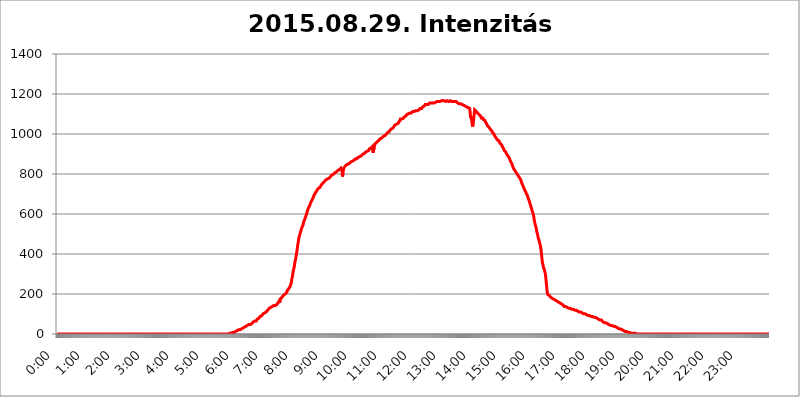
| Category | 2015.08.29. Intenzitás [W/m^2] |
|---|---|
| 0.0 | 0 |
| 0.0006944444444444445 | 0 |
| 0.001388888888888889 | 0 |
| 0.0020833333333333333 | 0 |
| 0.002777777777777778 | 0 |
| 0.003472222222222222 | 0 |
| 0.004166666666666667 | 0 |
| 0.004861111111111111 | 0 |
| 0.005555555555555556 | 0 |
| 0.0062499999999999995 | 0 |
| 0.006944444444444444 | 0 |
| 0.007638888888888889 | 0 |
| 0.008333333333333333 | 0 |
| 0.009027777777777779 | 0 |
| 0.009722222222222222 | 0 |
| 0.010416666666666666 | 0 |
| 0.011111111111111112 | 0 |
| 0.011805555555555555 | 0 |
| 0.012499999999999999 | 0 |
| 0.013194444444444444 | 0 |
| 0.013888888888888888 | 0 |
| 0.014583333333333332 | 0 |
| 0.015277777777777777 | 0 |
| 0.015972222222222224 | 0 |
| 0.016666666666666666 | 0 |
| 0.017361111111111112 | 0 |
| 0.018055555555555557 | 0 |
| 0.01875 | 0 |
| 0.019444444444444445 | 0 |
| 0.02013888888888889 | 0 |
| 0.020833333333333332 | 0 |
| 0.02152777777777778 | 0 |
| 0.022222222222222223 | 0 |
| 0.02291666666666667 | 0 |
| 0.02361111111111111 | 0 |
| 0.024305555555555556 | 0 |
| 0.024999999999999998 | 0 |
| 0.025694444444444447 | 0 |
| 0.02638888888888889 | 0 |
| 0.027083333333333334 | 0 |
| 0.027777777777777776 | 0 |
| 0.02847222222222222 | 0 |
| 0.029166666666666664 | 0 |
| 0.029861111111111113 | 0 |
| 0.030555555555555555 | 0 |
| 0.03125 | 0 |
| 0.03194444444444445 | 0 |
| 0.03263888888888889 | 0 |
| 0.03333333333333333 | 0 |
| 0.034027777777777775 | 0 |
| 0.034722222222222224 | 0 |
| 0.035416666666666666 | 0 |
| 0.036111111111111115 | 0 |
| 0.03680555555555556 | 0 |
| 0.0375 | 0 |
| 0.03819444444444444 | 0 |
| 0.03888888888888889 | 0 |
| 0.03958333333333333 | 0 |
| 0.04027777777777778 | 0 |
| 0.04097222222222222 | 0 |
| 0.041666666666666664 | 0 |
| 0.042361111111111106 | 0 |
| 0.04305555555555556 | 0 |
| 0.043750000000000004 | 0 |
| 0.044444444444444446 | 0 |
| 0.04513888888888889 | 0 |
| 0.04583333333333334 | 0 |
| 0.04652777777777778 | 0 |
| 0.04722222222222222 | 0 |
| 0.04791666666666666 | 0 |
| 0.04861111111111111 | 0 |
| 0.049305555555555554 | 0 |
| 0.049999999999999996 | 0 |
| 0.05069444444444445 | 0 |
| 0.051388888888888894 | 0 |
| 0.052083333333333336 | 0 |
| 0.05277777777777778 | 0 |
| 0.05347222222222222 | 0 |
| 0.05416666666666667 | 0 |
| 0.05486111111111111 | 0 |
| 0.05555555555555555 | 0 |
| 0.05625 | 0 |
| 0.05694444444444444 | 0 |
| 0.057638888888888885 | 0 |
| 0.05833333333333333 | 0 |
| 0.05902777777777778 | 0 |
| 0.059722222222222225 | 0 |
| 0.06041666666666667 | 0 |
| 0.061111111111111116 | 0 |
| 0.06180555555555556 | 0 |
| 0.0625 | 0 |
| 0.06319444444444444 | 0 |
| 0.06388888888888888 | 0 |
| 0.06458333333333334 | 0 |
| 0.06527777777777778 | 0 |
| 0.06597222222222222 | 0 |
| 0.06666666666666667 | 0 |
| 0.06736111111111111 | 0 |
| 0.06805555555555555 | 0 |
| 0.06874999999999999 | 0 |
| 0.06944444444444443 | 0 |
| 0.07013888888888889 | 0 |
| 0.07083333333333333 | 0 |
| 0.07152777777777779 | 0 |
| 0.07222222222222223 | 0 |
| 0.07291666666666667 | 0 |
| 0.07361111111111111 | 0 |
| 0.07430555555555556 | 0 |
| 0.075 | 0 |
| 0.07569444444444444 | 0 |
| 0.0763888888888889 | 0 |
| 0.07708333333333334 | 0 |
| 0.07777777777777778 | 0 |
| 0.07847222222222222 | 0 |
| 0.07916666666666666 | 0 |
| 0.0798611111111111 | 0 |
| 0.08055555555555556 | 0 |
| 0.08125 | 0 |
| 0.08194444444444444 | 0 |
| 0.08263888888888889 | 0 |
| 0.08333333333333333 | 0 |
| 0.08402777777777777 | 0 |
| 0.08472222222222221 | 0 |
| 0.08541666666666665 | 0 |
| 0.08611111111111112 | 0 |
| 0.08680555555555557 | 0 |
| 0.08750000000000001 | 0 |
| 0.08819444444444445 | 0 |
| 0.08888888888888889 | 0 |
| 0.08958333333333333 | 0 |
| 0.09027777777777778 | 0 |
| 0.09097222222222222 | 0 |
| 0.09166666666666667 | 0 |
| 0.09236111111111112 | 0 |
| 0.09305555555555556 | 0 |
| 0.09375 | 0 |
| 0.09444444444444444 | 0 |
| 0.09513888888888888 | 0 |
| 0.09583333333333333 | 0 |
| 0.09652777777777777 | 0 |
| 0.09722222222222222 | 0 |
| 0.09791666666666667 | 0 |
| 0.09861111111111111 | 0 |
| 0.09930555555555555 | 0 |
| 0.09999999999999999 | 0 |
| 0.10069444444444443 | 0 |
| 0.1013888888888889 | 0 |
| 0.10208333333333335 | 0 |
| 0.10277777777777779 | 0 |
| 0.10347222222222223 | 0 |
| 0.10416666666666667 | 0 |
| 0.10486111111111111 | 0 |
| 0.10555555555555556 | 0 |
| 0.10625 | 0 |
| 0.10694444444444444 | 0 |
| 0.1076388888888889 | 0 |
| 0.10833333333333334 | 0 |
| 0.10902777777777778 | 0 |
| 0.10972222222222222 | 0 |
| 0.1111111111111111 | 0 |
| 0.11180555555555556 | 0 |
| 0.11180555555555556 | 0 |
| 0.1125 | 0 |
| 0.11319444444444444 | 0 |
| 0.11388888888888889 | 0 |
| 0.11458333333333333 | 0 |
| 0.11527777777777777 | 0 |
| 0.11597222222222221 | 0 |
| 0.11666666666666665 | 0 |
| 0.1173611111111111 | 0 |
| 0.11805555555555557 | 0 |
| 0.11944444444444445 | 0 |
| 0.12013888888888889 | 0 |
| 0.12083333333333333 | 0 |
| 0.12152777777777778 | 0 |
| 0.12222222222222223 | 0 |
| 0.12291666666666667 | 0 |
| 0.12291666666666667 | 0 |
| 0.12361111111111112 | 0 |
| 0.12430555555555556 | 0 |
| 0.125 | 0 |
| 0.12569444444444444 | 0 |
| 0.12638888888888888 | 0 |
| 0.12708333333333333 | 0 |
| 0.16875 | 0 |
| 0.12847222222222224 | 0 |
| 0.12916666666666668 | 0 |
| 0.12986111111111112 | 0 |
| 0.13055555555555556 | 0 |
| 0.13125 | 0 |
| 0.13194444444444445 | 0 |
| 0.1326388888888889 | 0 |
| 0.13333333333333333 | 0 |
| 0.13402777777777777 | 0 |
| 0.13402777777777777 | 0 |
| 0.13472222222222222 | 0 |
| 0.13541666666666666 | 0 |
| 0.1361111111111111 | 0 |
| 0.13749999999999998 | 0 |
| 0.13819444444444443 | 0 |
| 0.1388888888888889 | 0 |
| 0.13958333333333334 | 0 |
| 0.14027777777777778 | 0 |
| 0.14097222222222222 | 0 |
| 0.14166666666666666 | 0 |
| 0.1423611111111111 | 0 |
| 0.14305555555555557 | 0 |
| 0.14375000000000002 | 0 |
| 0.14444444444444446 | 0 |
| 0.1451388888888889 | 0 |
| 0.1451388888888889 | 0 |
| 0.14652777777777778 | 0 |
| 0.14722222222222223 | 0 |
| 0.14791666666666667 | 0 |
| 0.1486111111111111 | 0 |
| 0.14930555555555555 | 0 |
| 0.15 | 0 |
| 0.15069444444444444 | 0 |
| 0.15138888888888888 | 0 |
| 0.15208333333333332 | 0 |
| 0.15277777777777776 | 0 |
| 0.15347222222222223 | 0 |
| 0.15416666666666667 | 0 |
| 0.15486111111111112 | 0 |
| 0.15555555555555556 | 0 |
| 0.15625 | 0 |
| 0.15694444444444444 | 0 |
| 0.15763888888888888 | 0 |
| 0.15833333333333333 | 0 |
| 0.15902777777777777 | 0 |
| 0.15972222222222224 | 0 |
| 0.16041666666666668 | 0 |
| 0.16111111111111112 | 0 |
| 0.16180555555555556 | 0 |
| 0.1625 | 0 |
| 0.16319444444444445 | 0 |
| 0.1638888888888889 | 0 |
| 0.16458333333333333 | 0 |
| 0.16527777777777777 | 0 |
| 0.16597222222222222 | 0 |
| 0.16666666666666666 | 0 |
| 0.1673611111111111 | 0 |
| 0.16805555555555554 | 0 |
| 0.16874999999999998 | 0 |
| 0.16944444444444443 | 0 |
| 0.17013888888888887 | 0 |
| 0.1708333333333333 | 0 |
| 0.17152777777777775 | 0 |
| 0.17222222222222225 | 0 |
| 0.1729166666666667 | 0 |
| 0.17361111111111113 | 0 |
| 0.17430555555555557 | 0 |
| 0.17500000000000002 | 0 |
| 0.17569444444444446 | 0 |
| 0.1763888888888889 | 0 |
| 0.17708333333333334 | 0 |
| 0.17777777777777778 | 0 |
| 0.17847222222222223 | 0 |
| 0.17916666666666667 | 0 |
| 0.1798611111111111 | 0 |
| 0.18055555555555555 | 0 |
| 0.18125 | 0 |
| 0.18194444444444444 | 0 |
| 0.1826388888888889 | 0 |
| 0.18333333333333335 | 0 |
| 0.1840277777777778 | 0 |
| 0.18472222222222223 | 0 |
| 0.18541666666666667 | 0 |
| 0.18611111111111112 | 0 |
| 0.18680555555555556 | 0 |
| 0.1875 | 0 |
| 0.18819444444444444 | 0 |
| 0.18888888888888888 | 0 |
| 0.18958333333333333 | 0 |
| 0.19027777777777777 | 0 |
| 0.1909722222222222 | 0 |
| 0.19166666666666665 | 0 |
| 0.19236111111111112 | 0 |
| 0.19305555555555554 | 0 |
| 0.19375 | 0 |
| 0.19444444444444445 | 0 |
| 0.1951388888888889 | 0 |
| 0.19583333333333333 | 0 |
| 0.19652777777777777 | 0 |
| 0.19722222222222222 | 0 |
| 0.19791666666666666 | 0 |
| 0.1986111111111111 | 0 |
| 0.19930555555555554 | 0 |
| 0.19999999999999998 | 0 |
| 0.20069444444444443 | 0 |
| 0.20138888888888887 | 0 |
| 0.2020833333333333 | 0 |
| 0.2027777777777778 | 0 |
| 0.2034722222222222 | 0 |
| 0.2041666666666667 | 0 |
| 0.20486111111111113 | 0 |
| 0.20555555555555557 | 0 |
| 0.20625000000000002 | 0 |
| 0.20694444444444446 | 0 |
| 0.2076388888888889 | 0 |
| 0.20833333333333334 | 0 |
| 0.20902777777777778 | 0 |
| 0.20972222222222223 | 0 |
| 0.21041666666666667 | 0 |
| 0.2111111111111111 | 0 |
| 0.21180555555555555 | 0 |
| 0.2125 | 0 |
| 0.21319444444444444 | 0 |
| 0.2138888888888889 | 0 |
| 0.21458333333333335 | 0 |
| 0.2152777777777778 | 0 |
| 0.21597222222222223 | 0 |
| 0.21666666666666667 | 0 |
| 0.21736111111111112 | 0 |
| 0.21805555555555556 | 0 |
| 0.21875 | 0 |
| 0.21944444444444444 | 0 |
| 0.22013888888888888 | 0 |
| 0.22083333333333333 | 0 |
| 0.22152777777777777 | 0 |
| 0.2222222222222222 | 0 |
| 0.22291666666666665 | 0 |
| 0.2236111111111111 | 0 |
| 0.22430555555555556 | 0 |
| 0.225 | 0 |
| 0.22569444444444445 | 0 |
| 0.2263888888888889 | 0 |
| 0.22708333333333333 | 0 |
| 0.22777777777777777 | 0 |
| 0.22847222222222222 | 0 |
| 0.22916666666666666 | 0 |
| 0.2298611111111111 | 0 |
| 0.23055555555555554 | 0 |
| 0.23124999999999998 | 0 |
| 0.23194444444444443 | 0 |
| 0.23263888888888887 | 0 |
| 0.2333333333333333 | 0 |
| 0.2340277777777778 | 0 |
| 0.2347222222222222 | 0 |
| 0.2354166666666667 | 0 |
| 0.23611111111111113 | 0 |
| 0.23680555555555557 | 0 |
| 0.23750000000000002 | 0 |
| 0.23819444444444446 | 3.525 |
| 0.2388888888888889 | 0 |
| 0.23958333333333334 | 0 |
| 0.24027777777777778 | 3.525 |
| 0.24097222222222223 | 3.525 |
| 0.24166666666666667 | 3.525 |
| 0.2423611111111111 | 3.525 |
| 0.24305555555555555 | 3.525 |
| 0.24375 | 3.525 |
| 0.24444444444444446 | 3.525 |
| 0.24513888888888888 | 3.525 |
| 0.24583333333333335 | 7.887 |
| 0.2465277777777778 | 7.887 |
| 0.24722222222222223 | 7.887 |
| 0.24791666666666667 | 7.887 |
| 0.24861111111111112 | 7.887 |
| 0.24930555555555556 | 12.257 |
| 0.25 | 12.257 |
| 0.25069444444444444 | 12.257 |
| 0.2513888888888889 | 12.257 |
| 0.2520833333333333 | 16.636 |
| 0.25277777777777777 | 16.636 |
| 0.2534722222222222 | 16.636 |
| 0.25416666666666665 | 21.024 |
| 0.2548611111111111 | 21.024 |
| 0.2555555555555556 | 21.024 |
| 0.25625000000000003 | 21.024 |
| 0.2569444444444445 | 25.419 |
| 0.2576388888888889 | 25.419 |
| 0.25833333333333336 | 25.419 |
| 0.2590277777777778 | 29.823 |
| 0.25972222222222224 | 29.823 |
| 0.2604166666666667 | 29.823 |
| 0.2611111111111111 | 34.234 |
| 0.26180555555555557 | 34.234 |
| 0.2625 | 34.234 |
| 0.26319444444444445 | 34.234 |
| 0.2638888888888889 | 34.234 |
| 0.26458333333333334 | 38.653 |
| 0.2652777777777778 | 38.653 |
| 0.2659722222222222 | 38.653 |
| 0.26666666666666666 | 43.079 |
| 0.2673611111111111 | 43.079 |
| 0.26805555555555555 | 43.079 |
| 0.26875 | 47.511 |
| 0.26944444444444443 | 47.511 |
| 0.2701388888888889 | 47.511 |
| 0.2708333333333333 | 47.511 |
| 0.27152777777777776 | 51.951 |
| 0.2722222222222222 | 51.951 |
| 0.27291666666666664 | 51.951 |
| 0.2736111111111111 | 56.398 |
| 0.2743055555555555 | 56.398 |
| 0.27499999999999997 | 60.85 |
| 0.27569444444444446 | 60.85 |
| 0.27638888888888885 | 60.85 |
| 0.27708333333333335 | 65.31 |
| 0.2777777777777778 | 65.31 |
| 0.27847222222222223 | 65.31 |
| 0.2791666666666667 | 65.31 |
| 0.2798611111111111 | 69.775 |
| 0.28055555555555556 | 74.246 |
| 0.28125 | 74.246 |
| 0.28194444444444444 | 74.246 |
| 0.2826388888888889 | 78.722 |
| 0.2833333333333333 | 83.205 |
| 0.28402777777777777 | 83.205 |
| 0.2847222222222222 | 87.692 |
| 0.28541666666666665 | 87.692 |
| 0.28611111111111115 | 92.184 |
| 0.28680555555555554 | 92.184 |
| 0.28750000000000003 | 96.682 |
| 0.2881944444444445 | 96.682 |
| 0.2888888888888889 | 101.184 |
| 0.28958333333333336 | 101.184 |
| 0.2902777777777778 | 105.69 |
| 0.29097222222222224 | 105.69 |
| 0.2916666666666667 | 110.201 |
| 0.2923611111111111 | 110.201 |
| 0.29305555555555557 | 110.201 |
| 0.29375 | 114.716 |
| 0.29444444444444445 | 114.716 |
| 0.2951388888888889 | 119.235 |
| 0.29583333333333334 | 119.235 |
| 0.2965277777777778 | 123.758 |
| 0.2972222222222222 | 128.284 |
| 0.29791666666666666 | 128.284 |
| 0.2986111111111111 | 128.284 |
| 0.29930555555555555 | 132.814 |
| 0.3 | 132.814 |
| 0.30069444444444443 | 132.814 |
| 0.3013888888888889 | 137.347 |
| 0.3020833333333333 | 141.884 |
| 0.30277777777777776 | 141.884 |
| 0.3034722222222222 | 141.884 |
| 0.30416666666666664 | 146.423 |
| 0.3048611111111111 | 141.884 |
| 0.3055555555555555 | 141.884 |
| 0.30624999999999997 | 137.347 |
| 0.3069444444444444 | 141.884 |
| 0.3076388888888889 | 146.423 |
| 0.30833333333333335 | 146.423 |
| 0.3090277777777778 | 150.964 |
| 0.30972222222222223 | 155.509 |
| 0.3104166666666667 | 160.056 |
| 0.3111111111111111 | 164.605 |
| 0.31180555555555556 | 155.509 |
| 0.3125 | 169.156 |
| 0.31319444444444444 | 173.709 |
| 0.3138888888888889 | 178.264 |
| 0.3145833333333333 | 173.709 |
| 0.31527777777777777 | 182.82 |
| 0.3159722222222222 | 187.378 |
| 0.31666666666666665 | 191.937 |
| 0.31736111111111115 | 191.937 |
| 0.31805555555555554 | 196.497 |
| 0.31875000000000003 | 196.497 |
| 0.3194444444444445 | 201.058 |
| 0.3201388888888889 | 201.058 |
| 0.32083333333333336 | 201.058 |
| 0.3215277777777778 | 205.62 |
| 0.32222222222222224 | 210.182 |
| 0.3229166666666667 | 219.309 |
| 0.3236111111111111 | 223.873 |
| 0.32430555555555557 | 223.873 |
| 0.325 | 228.436 |
| 0.32569444444444445 | 233 |
| 0.3263888888888889 | 233 |
| 0.32708333333333334 | 242.127 |
| 0.3277777777777778 | 246.689 |
| 0.3284722222222222 | 260.373 |
| 0.32916666666666666 | 278.603 |
| 0.3298611111111111 | 287.709 |
| 0.33055555555555555 | 305.898 |
| 0.33125 | 319.517 |
| 0.33194444444444443 | 328.584 |
| 0.3326388888888889 | 342.162 |
| 0.3333333333333333 | 360.221 |
| 0.3340277777777778 | 369.23 |
| 0.3347222222222222 | 382.715 |
| 0.3354166666666667 | 400.638 |
| 0.3361111111111111 | 414.035 |
| 0.3368055555555556 | 431.833 |
| 0.33749999999999997 | 449.551 |
| 0.33819444444444446 | 462.786 |
| 0.33888888888888885 | 480.356 |
| 0.33958333333333335 | 489.108 |
| 0.34027777777777773 | 497.836 |
| 0.34097222222222223 | 506.542 |
| 0.3416666666666666 | 515.223 |
| 0.3423611111111111 | 523.88 |
| 0.3430555555555555 | 532.513 |
| 0.34375 | 536.82 |
| 0.3444444444444445 | 541.121 |
| 0.3451388888888889 | 553.986 |
| 0.3458333333333334 | 562.53 |
| 0.34652777777777777 | 566.793 |
| 0.34722222222222227 | 575.299 |
| 0.34791666666666665 | 579.542 |
| 0.34861111111111115 | 588.009 |
| 0.34930555555555554 | 596.45 |
| 0.35000000000000003 | 604.864 |
| 0.3506944444444444 | 613.252 |
| 0.3513888888888889 | 621.613 |
| 0.3520833333333333 | 625.784 |
| 0.3527777777777778 | 634.105 |
| 0.3534722222222222 | 638.256 |
| 0.3541666666666667 | 642.4 |
| 0.3548611111111111 | 650.667 |
| 0.35555555555555557 | 654.791 |
| 0.35625 | 663.019 |
| 0.35694444444444445 | 667.123 |
| 0.3576388888888889 | 671.22 |
| 0.35833333333333334 | 675.311 |
| 0.3590277777777778 | 683.473 |
| 0.3597222222222222 | 687.544 |
| 0.36041666666666666 | 695.666 |
| 0.3611111111111111 | 699.717 |
| 0.36180555555555555 | 703.762 |
| 0.3625 | 707.8 |
| 0.36319444444444443 | 711.832 |
| 0.3638888888888889 | 715.858 |
| 0.3645833333333333 | 719.877 |
| 0.3652777777777778 | 723.889 |
| 0.3659722222222222 | 727.896 |
| 0.3666666666666667 | 727.896 |
| 0.3673611111111111 | 727.896 |
| 0.3680555555555556 | 731.896 |
| 0.36874999999999997 | 735.89 |
| 0.36944444444444446 | 739.877 |
| 0.37013888888888885 | 743.859 |
| 0.37083333333333335 | 747.834 |
| 0.37152777777777773 | 751.803 |
| 0.37222222222222223 | 751.803 |
| 0.3729166666666666 | 755.766 |
| 0.3736111111111111 | 759.723 |
| 0.3743055555555555 | 759.723 |
| 0.375 | 763.674 |
| 0.3756944444444445 | 767.62 |
| 0.3763888888888889 | 767.62 |
| 0.3770833333333334 | 771.559 |
| 0.37777777777777777 | 771.559 |
| 0.37847222222222227 | 775.492 |
| 0.37916666666666665 | 775.492 |
| 0.37986111111111115 | 775.492 |
| 0.38055555555555554 | 779.42 |
| 0.38125000000000003 | 779.42 |
| 0.3819444444444444 | 783.342 |
| 0.3826388888888889 | 783.342 |
| 0.3833333333333333 | 787.258 |
| 0.3840277777777778 | 787.258 |
| 0.3847222222222222 | 791.169 |
| 0.3854166666666667 | 795.074 |
| 0.3861111111111111 | 798.974 |
| 0.38680555555555557 | 798.974 |
| 0.3875 | 798.974 |
| 0.38819444444444445 | 802.868 |
| 0.3888888888888889 | 802.868 |
| 0.38958333333333334 | 806.757 |
| 0.3902777777777778 | 806.757 |
| 0.3909722222222222 | 806.757 |
| 0.39166666666666666 | 810.641 |
| 0.3923611111111111 | 814.519 |
| 0.39305555555555555 | 814.519 |
| 0.39375 | 818.392 |
| 0.39444444444444443 | 818.392 |
| 0.3951388888888889 | 822.26 |
| 0.3958333333333333 | 822.26 |
| 0.3965277777777778 | 822.26 |
| 0.3972222222222222 | 826.123 |
| 0.3979166666666667 | 829.981 |
| 0.3986111111111111 | 833.834 |
| 0.3993055555555556 | 822.26 |
| 0.39999999999999997 | 787.258 |
| 0.40069444444444446 | 802.868 |
| 0.40138888888888885 | 822.26 |
| 0.40208333333333335 | 829.981 |
| 0.40277777777777773 | 833.834 |
| 0.40347222222222223 | 837.682 |
| 0.4041666666666666 | 841.526 |
| 0.4048611111111111 | 841.526 |
| 0.4055555555555555 | 845.365 |
| 0.40625 | 845.365 |
| 0.4069444444444445 | 849.199 |
| 0.4076388888888889 | 849.199 |
| 0.4083333333333334 | 853.029 |
| 0.40902777777777777 | 853.029 |
| 0.40972222222222227 | 853.029 |
| 0.41041666666666665 | 856.855 |
| 0.41111111111111115 | 856.855 |
| 0.41180555555555554 | 860.676 |
| 0.41250000000000003 | 860.676 |
| 0.4131944444444444 | 860.676 |
| 0.4138888888888889 | 864.493 |
| 0.4145833333333333 | 868.305 |
| 0.4152777777777778 | 868.305 |
| 0.4159722222222222 | 868.305 |
| 0.4166666666666667 | 872.114 |
| 0.4173611111111111 | 872.114 |
| 0.41805555555555557 | 875.918 |
| 0.41875 | 875.918 |
| 0.41944444444444445 | 875.918 |
| 0.4201388888888889 | 875.918 |
| 0.42083333333333334 | 879.719 |
| 0.4215277777777778 | 879.719 |
| 0.4222222222222222 | 883.516 |
| 0.42291666666666666 | 883.516 |
| 0.4236111111111111 | 883.516 |
| 0.42430555555555555 | 887.309 |
| 0.425 | 887.309 |
| 0.42569444444444443 | 887.309 |
| 0.4263888888888889 | 891.099 |
| 0.4270833333333333 | 894.885 |
| 0.4277777777777778 | 894.885 |
| 0.4284722222222222 | 898.668 |
| 0.4291666666666667 | 902.447 |
| 0.4298611111111111 | 902.447 |
| 0.4305555555555556 | 902.447 |
| 0.43124999999999997 | 902.447 |
| 0.43194444444444446 | 906.223 |
| 0.43263888888888885 | 909.996 |
| 0.43333333333333335 | 913.766 |
| 0.43402777777777773 | 913.766 |
| 0.43472222222222223 | 913.766 |
| 0.4354166666666666 | 917.534 |
| 0.4361111111111111 | 917.534 |
| 0.4368055555555555 | 917.534 |
| 0.4375 | 925.06 |
| 0.4381944444444445 | 925.06 |
| 0.4388888888888889 | 928.819 |
| 0.4395833333333334 | 928.819 |
| 0.44027777777777777 | 932.576 |
| 0.44097222222222227 | 932.576 |
| 0.44166666666666665 | 936.33 |
| 0.44236111111111115 | 936.33 |
| 0.44305555555555554 | 906.223 |
| 0.44375000000000003 | 909.996 |
| 0.4444444444444444 | 932.576 |
| 0.4451388888888889 | 947.58 |
| 0.4458333333333333 | 947.58 |
| 0.4465277777777778 | 951.327 |
| 0.4472222222222222 | 955.071 |
| 0.4479166666666667 | 955.071 |
| 0.4486111111111111 | 958.814 |
| 0.44930555555555557 | 962.555 |
| 0.45 | 962.555 |
| 0.45069444444444445 | 966.295 |
| 0.4513888888888889 | 970.034 |
| 0.45208333333333334 | 970.034 |
| 0.4527777777777778 | 973.772 |
| 0.4534722222222222 | 977.508 |
| 0.45416666666666666 | 977.508 |
| 0.4548611111111111 | 981.244 |
| 0.45555555555555555 | 981.244 |
| 0.45625 | 984.98 |
| 0.45694444444444443 | 984.98 |
| 0.4576388888888889 | 988.714 |
| 0.4583333333333333 | 988.714 |
| 0.4590277777777778 | 992.448 |
| 0.4597222222222222 | 992.448 |
| 0.4604166666666667 | 992.448 |
| 0.4611111111111111 | 996.182 |
| 0.4618055555555556 | 999.916 |
| 0.46249999999999997 | 1003.65 |
| 0.46319444444444446 | 1007.383 |
| 0.46388888888888885 | 1007.383 |
| 0.46458333333333335 | 1011.118 |
| 0.46527777777777773 | 1011.118 |
| 0.46597222222222223 | 1014.852 |
| 0.4666666666666666 | 1018.587 |
| 0.4673611111111111 | 1014.852 |
| 0.4680555555555555 | 1022.323 |
| 0.46875 | 1026.06 |
| 0.4694444444444445 | 1029.798 |
| 0.4701388888888889 | 1029.798 |
| 0.4708333333333334 | 1029.798 |
| 0.47152777777777777 | 1033.537 |
| 0.47222222222222227 | 1037.277 |
| 0.47291666666666665 | 1037.277 |
| 0.47361111111111115 | 1044.762 |
| 0.47430555555555554 | 1044.762 |
| 0.47500000000000003 | 1048.508 |
| 0.4756944444444444 | 1048.508 |
| 0.4763888888888889 | 1048.508 |
| 0.4770833333333333 | 1048.508 |
| 0.4777777777777778 | 1052.255 |
| 0.4784722222222222 | 1052.255 |
| 0.4791666666666667 | 1059.756 |
| 0.4798611111111111 | 1063.51 |
| 0.48055555555555557 | 1067.267 |
| 0.48125 | 1074.789 |
| 0.48194444444444445 | 1071.027 |
| 0.4826388888888889 | 1071.027 |
| 0.48333333333333334 | 1074.789 |
| 0.4840277777777778 | 1074.789 |
| 0.4847222222222222 | 1074.789 |
| 0.48541666666666666 | 1078.555 |
| 0.4861111111111111 | 1078.555 |
| 0.48680555555555555 | 1086.097 |
| 0.4875 | 1086.097 |
| 0.48819444444444443 | 1086.097 |
| 0.4888888888888889 | 1089.873 |
| 0.4895833333333333 | 1093.653 |
| 0.4902777777777778 | 1097.437 |
| 0.4909722222222222 | 1097.437 |
| 0.4916666666666667 | 1101.226 |
| 0.4923611111111111 | 1101.226 |
| 0.4930555555555556 | 1101.226 |
| 0.49374999999999997 | 1101.226 |
| 0.49444444444444446 | 1105.019 |
| 0.49513888888888885 | 1101.226 |
| 0.49583333333333335 | 1105.019 |
| 0.49652777777777773 | 1105.019 |
| 0.49722222222222223 | 1108.816 |
| 0.4979166666666666 | 1108.816 |
| 0.4986111111111111 | 1112.618 |
| 0.4993055555555555 | 1112.618 |
| 0.5 | 1112.618 |
| 0.5006944444444444 | 1112.618 |
| 0.5013888888888889 | 1116.426 |
| 0.5020833333333333 | 1116.426 |
| 0.5027777777777778 | 1116.426 |
| 0.5034722222222222 | 1116.426 |
| 0.5041666666666667 | 1116.426 |
| 0.5048611111111111 | 1116.426 |
| 0.5055555555555555 | 1116.426 |
| 0.50625 | 1116.426 |
| 0.5069444444444444 | 1120.238 |
| 0.5076388888888889 | 1124.056 |
| 0.5083333333333333 | 1124.056 |
| 0.5090277777777777 | 1127.879 |
| 0.5097222222222222 | 1127.879 |
| 0.5104166666666666 | 1127.879 |
| 0.5111111111111112 | 1127.879 |
| 0.5118055555555555 | 1131.708 |
| 0.5125000000000001 | 1135.543 |
| 0.5131944444444444 | 1135.543 |
| 0.513888888888889 | 1139.384 |
| 0.5145833333333333 | 1139.384 |
| 0.5152777777777778 | 1143.232 |
| 0.5159722222222222 | 1147.086 |
| 0.5166666666666667 | 1147.086 |
| 0.517361111111111 | 1147.086 |
| 0.5180555555555556 | 1147.086 |
| 0.5187499999999999 | 1147.086 |
| 0.5194444444444445 | 1147.086 |
| 0.5201388888888888 | 1147.086 |
| 0.5208333333333334 | 1150.946 |
| 0.5215277777777778 | 1150.946 |
| 0.5222222222222223 | 1154.814 |
| 0.5229166666666667 | 1154.814 |
| 0.5236111111111111 | 1154.814 |
| 0.5243055555555556 | 1154.814 |
| 0.525 | 1154.814 |
| 0.5256944444444445 | 1154.814 |
| 0.5263888888888889 | 1154.814 |
| 0.5270833333333333 | 1154.814 |
| 0.5277777777777778 | 1154.814 |
| 0.5284722222222222 | 1154.814 |
| 0.5291666666666667 | 1158.689 |
| 0.5298611111111111 | 1158.689 |
| 0.5305555555555556 | 1158.689 |
| 0.53125 | 1162.571 |
| 0.5319444444444444 | 1162.571 |
| 0.5326388888888889 | 1162.571 |
| 0.5333333333333333 | 1162.571 |
| 0.5340277777777778 | 1158.689 |
| 0.5347222222222222 | 1162.571 |
| 0.5354166666666667 | 1162.571 |
| 0.5361111111111111 | 1162.571 |
| 0.5368055555555555 | 1162.571 |
| 0.5375 | 1166.46 |
| 0.5381944444444444 | 1162.571 |
| 0.5388888888888889 | 1166.46 |
| 0.5395833333333333 | 1166.46 |
| 0.5402777777777777 | 1166.46 |
| 0.5409722222222222 | 1166.46 |
| 0.5416666666666666 | 1166.46 |
| 0.5423611111111112 | 1170.358 |
| 0.5430555555555555 | 1166.46 |
| 0.5437500000000001 | 1166.46 |
| 0.5444444444444444 | 1162.571 |
| 0.545138888888889 | 1162.571 |
| 0.5458333333333333 | 1166.46 |
| 0.5465277777777778 | 1162.571 |
| 0.5472222222222222 | 1166.46 |
| 0.5479166666666667 | 1162.571 |
| 0.548611111111111 | 1162.571 |
| 0.5493055555555556 | 1162.571 |
| 0.5499999999999999 | 1162.571 |
| 0.5506944444444445 | 1166.46 |
| 0.5513888888888888 | 1166.46 |
| 0.5520833333333334 | 1166.46 |
| 0.5527777777777778 | 1162.571 |
| 0.5534722222222223 | 1162.571 |
| 0.5541666666666667 | 1162.571 |
| 0.5548611111111111 | 1162.571 |
| 0.5555555555555556 | 1162.571 |
| 0.55625 | 1162.571 |
| 0.5569444444444445 | 1162.571 |
| 0.5576388888888889 | 1162.571 |
| 0.5583333333333333 | 1166.46 |
| 0.5590277777777778 | 1162.571 |
| 0.5597222222222222 | 1162.571 |
| 0.5604166666666667 | 1162.571 |
| 0.5611111111111111 | 1162.571 |
| 0.5618055555555556 | 1154.814 |
| 0.5625 | 1154.814 |
| 0.5631944444444444 | 1154.814 |
| 0.5638888888888889 | 1150.946 |
| 0.5645833333333333 | 1150.946 |
| 0.5652777777777778 | 1150.946 |
| 0.5659722222222222 | 1150.946 |
| 0.5666666666666667 | 1150.946 |
| 0.5673611111111111 | 1147.086 |
| 0.5680555555555555 | 1147.086 |
| 0.56875 | 1147.086 |
| 0.5694444444444444 | 1143.232 |
| 0.5701388888888889 | 1143.232 |
| 0.5708333333333333 | 1139.384 |
| 0.5715277777777777 | 1139.384 |
| 0.5722222222222222 | 1139.384 |
| 0.5729166666666666 | 1135.543 |
| 0.5736111111111112 | 1135.543 |
| 0.5743055555555555 | 1135.543 |
| 0.5750000000000001 | 1135.543 |
| 0.5756944444444444 | 1131.708 |
| 0.576388888888889 | 1131.708 |
| 0.5770833333333333 | 1135.543 |
| 0.5777777777777778 | 1135.543 |
| 0.5784722222222222 | 1127.879 |
| 0.5791666666666667 | 1105.019 |
| 0.579861111111111 | 1078.555 |
| 0.5805555555555556 | 1086.097 |
| 0.5812499999999999 | 1071.027 |
| 0.5819444444444445 | 1048.508 |
| 0.5826388888888888 | 1037.277 |
| 0.5833333333333334 | 1056.004 |
| 0.5840277777777778 | 1074.789 |
| 0.5847222222222223 | 1097.437 |
| 0.5854166666666667 | 1120.238 |
| 0.5861111111111111 | 1120.238 |
| 0.5868055555555556 | 1116.426 |
| 0.5875 | 1112.618 |
| 0.5881944444444445 | 1108.816 |
| 0.5888888888888889 | 1108.816 |
| 0.5895833333333333 | 1105.019 |
| 0.5902777777777778 | 1105.019 |
| 0.5909722222222222 | 1101.226 |
| 0.5916666666666667 | 1097.437 |
| 0.5923611111111111 | 1097.437 |
| 0.5930555555555556 | 1093.653 |
| 0.59375 | 1089.873 |
| 0.5944444444444444 | 1086.097 |
| 0.5951388888888889 | 1078.555 |
| 0.5958333333333333 | 1082.324 |
| 0.5965277777777778 | 1078.555 |
| 0.5972222222222222 | 1078.555 |
| 0.5979166666666667 | 1071.027 |
| 0.5986111111111111 | 1071.027 |
| 0.5993055555555555 | 1067.267 |
| 0.6 | 1067.267 |
| 0.6006944444444444 | 1059.756 |
| 0.6013888888888889 | 1059.756 |
| 0.6020833333333333 | 1052.255 |
| 0.6027777777777777 | 1048.508 |
| 0.6034722222222222 | 1041.019 |
| 0.6041666666666666 | 1041.019 |
| 0.6048611111111112 | 1041.019 |
| 0.6055555555555555 | 1033.537 |
| 0.6062500000000001 | 1029.798 |
| 0.6069444444444444 | 1029.798 |
| 0.607638888888889 | 1022.323 |
| 0.6083333333333333 | 1018.587 |
| 0.6090277777777778 | 1018.587 |
| 0.6097222222222222 | 1014.852 |
| 0.6104166666666667 | 1007.383 |
| 0.611111111111111 | 1003.65 |
| 0.6118055555555556 | 1003.65 |
| 0.6124999999999999 | 999.916 |
| 0.6131944444444445 | 992.448 |
| 0.6138888888888888 | 992.448 |
| 0.6145833333333334 | 984.98 |
| 0.6152777777777778 | 984.98 |
| 0.6159722222222223 | 977.508 |
| 0.6166666666666667 | 973.772 |
| 0.6173611111111111 | 970.034 |
| 0.6180555555555556 | 970.034 |
| 0.61875 | 966.295 |
| 0.6194444444444445 | 966.295 |
| 0.6201388888888889 | 958.814 |
| 0.6208333333333333 | 955.071 |
| 0.6215277777777778 | 951.327 |
| 0.6222222222222222 | 951.327 |
| 0.6229166666666667 | 947.58 |
| 0.6236111111111111 | 943.832 |
| 0.6243055555555556 | 936.33 |
| 0.625 | 932.576 |
| 0.6256944444444444 | 928.819 |
| 0.6263888888888889 | 925.06 |
| 0.6270833333333333 | 917.534 |
| 0.6277777777777778 | 913.766 |
| 0.6284722222222222 | 913.766 |
| 0.6291666666666667 | 909.996 |
| 0.6298611111111111 | 902.447 |
| 0.6305555555555555 | 902.447 |
| 0.63125 | 894.885 |
| 0.6319444444444444 | 894.885 |
| 0.6326388888888889 | 887.309 |
| 0.6333333333333333 | 883.516 |
| 0.6340277777777777 | 879.719 |
| 0.6347222222222222 | 872.114 |
| 0.6354166666666666 | 868.305 |
| 0.6361111111111112 | 860.676 |
| 0.6368055555555555 | 856.855 |
| 0.6375000000000001 | 853.029 |
| 0.6381944444444444 | 845.365 |
| 0.638888888888889 | 837.682 |
| 0.6395833333333333 | 829.981 |
| 0.6402777777777778 | 829.981 |
| 0.6409722222222222 | 826.123 |
| 0.6416666666666667 | 818.392 |
| 0.642361111111111 | 814.519 |
| 0.6430555555555556 | 810.641 |
| 0.6437499999999999 | 806.757 |
| 0.6444444444444445 | 802.868 |
| 0.6451388888888888 | 798.974 |
| 0.6458333333333334 | 795.074 |
| 0.6465277777777778 | 791.169 |
| 0.6472222222222223 | 787.258 |
| 0.6479166666666667 | 783.342 |
| 0.6486111111111111 | 779.42 |
| 0.6493055555555556 | 775.492 |
| 0.65 | 771.559 |
| 0.6506944444444445 | 763.674 |
| 0.6513888888888889 | 755.766 |
| 0.6520833333333333 | 751.803 |
| 0.6527777777777778 | 743.859 |
| 0.6534722222222222 | 739.877 |
| 0.6541666666666667 | 731.896 |
| 0.6548611111111111 | 727.896 |
| 0.6555555555555556 | 719.877 |
| 0.65625 | 715.858 |
| 0.6569444444444444 | 711.832 |
| 0.6576388888888889 | 703.762 |
| 0.6583333333333333 | 703.762 |
| 0.6590277777777778 | 695.666 |
| 0.6597222222222222 | 687.544 |
| 0.6604166666666667 | 679.395 |
| 0.6611111111111111 | 675.311 |
| 0.6618055555555555 | 667.123 |
| 0.6625 | 658.909 |
| 0.6631944444444444 | 650.667 |
| 0.6638888888888889 | 642.4 |
| 0.6645833333333333 | 634.105 |
| 0.6652777777777777 | 625.784 |
| 0.6659722222222222 | 617.436 |
| 0.6666666666666666 | 609.062 |
| 0.6673611111111111 | 600.661 |
| 0.6680555555555556 | 592.233 |
| 0.6687500000000001 | 575.299 |
| 0.6694444444444444 | 562.53 |
| 0.6701388888888888 | 549.704 |
| 0.6708333333333334 | 541.121 |
| 0.6715277777777778 | 532.513 |
| 0.6722222222222222 | 519.555 |
| 0.6729166666666666 | 506.542 |
| 0.6736111111111112 | 497.836 |
| 0.6743055555555556 | 484.735 |
| 0.6749999999999999 | 475.972 |
| 0.6756944444444444 | 467.187 |
| 0.6763888888888889 | 458.38 |
| 0.6770833333333334 | 449.551 |
| 0.6777777777777777 | 436.27 |
| 0.6784722222222223 | 422.943 |
| 0.6791666666666667 | 400.638 |
| 0.6798611111111111 | 373.729 |
| 0.6805555555555555 | 355.712 |
| 0.68125 | 346.682 |
| 0.6819444444444445 | 333.113 |
| 0.6826388888888889 | 328.584 |
| 0.6833333333333332 | 319.517 |
| 0.6840277777777778 | 310.44 |
| 0.6847222222222222 | 296.808 |
| 0.6854166666666667 | 274.047 |
| 0.686111111111111 | 246.689 |
| 0.6868055555555556 | 219.309 |
| 0.6875 | 205.62 |
| 0.6881944444444444 | 196.497 |
| 0.688888888888889 | 196.497 |
| 0.6895833333333333 | 191.937 |
| 0.6902777777777778 | 191.937 |
| 0.6909722222222222 | 187.378 |
| 0.6916666666666668 | 187.378 |
| 0.6923611111111111 | 182.82 |
| 0.6930555555555555 | 182.82 |
| 0.69375 | 182.82 |
| 0.6944444444444445 | 178.264 |
| 0.6951388888888889 | 178.264 |
| 0.6958333333333333 | 173.709 |
| 0.6965277777777777 | 173.709 |
| 0.6972222222222223 | 173.709 |
| 0.6979166666666666 | 173.709 |
| 0.6986111111111111 | 169.156 |
| 0.6993055555555556 | 169.156 |
| 0.7000000000000001 | 164.605 |
| 0.7006944444444444 | 164.605 |
| 0.7013888888888888 | 164.605 |
| 0.7020833333333334 | 160.056 |
| 0.7027777777777778 | 160.056 |
| 0.7034722222222222 | 160.056 |
| 0.7041666666666666 | 160.056 |
| 0.7048611111111112 | 155.509 |
| 0.7055555555555556 | 155.509 |
| 0.7062499999999999 | 155.509 |
| 0.7069444444444444 | 150.964 |
| 0.7076388888888889 | 150.964 |
| 0.7083333333333334 | 150.964 |
| 0.7090277777777777 | 146.423 |
| 0.7097222222222223 | 146.423 |
| 0.7104166666666667 | 141.884 |
| 0.7111111111111111 | 137.347 |
| 0.7118055555555555 | 137.347 |
| 0.7125 | 137.347 |
| 0.7131944444444445 | 137.347 |
| 0.7138888888888889 | 132.814 |
| 0.7145833333333332 | 132.814 |
| 0.7152777777777778 | 132.814 |
| 0.7159722222222222 | 132.814 |
| 0.7166666666666667 | 132.814 |
| 0.717361111111111 | 128.284 |
| 0.7180555555555556 | 128.284 |
| 0.71875 | 128.284 |
| 0.7194444444444444 | 128.284 |
| 0.720138888888889 | 128.284 |
| 0.7208333333333333 | 128.284 |
| 0.7215277777777778 | 123.758 |
| 0.7222222222222222 | 123.758 |
| 0.7229166666666668 | 123.758 |
| 0.7236111111111111 | 123.758 |
| 0.7243055555555555 | 119.235 |
| 0.725 | 119.235 |
| 0.7256944444444445 | 119.235 |
| 0.7263888888888889 | 119.235 |
| 0.7270833333333333 | 119.235 |
| 0.7277777777777777 | 119.235 |
| 0.7284722222222223 | 114.716 |
| 0.7291666666666666 | 114.716 |
| 0.7298611111111111 | 114.716 |
| 0.7305555555555556 | 114.716 |
| 0.7312500000000001 | 114.716 |
| 0.7319444444444444 | 110.201 |
| 0.7326388888888888 | 110.201 |
| 0.7333333333333334 | 110.201 |
| 0.7340277777777778 | 110.201 |
| 0.7347222222222222 | 110.201 |
| 0.7354166666666666 | 105.69 |
| 0.7361111111111112 | 105.69 |
| 0.7368055555555556 | 105.69 |
| 0.7374999999999999 | 105.69 |
| 0.7381944444444444 | 101.184 |
| 0.7388888888888889 | 101.184 |
| 0.7395833333333334 | 101.184 |
| 0.7402777777777777 | 101.184 |
| 0.7409722222222223 | 101.184 |
| 0.7416666666666667 | 96.682 |
| 0.7423611111111111 | 96.682 |
| 0.7430555555555555 | 96.682 |
| 0.74375 | 96.682 |
| 0.7444444444444445 | 92.184 |
| 0.7451388888888889 | 92.184 |
| 0.7458333333333332 | 92.184 |
| 0.7465277777777778 | 92.184 |
| 0.7472222222222222 | 92.184 |
| 0.7479166666666667 | 92.184 |
| 0.748611111111111 | 87.692 |
| 0.7493055555555556 | 87.692 |
| 0.75 | 87.692 |
| 0.7506944444444444 | 87.692 |
| 0.751388888888889 | 83.205 |
| 0.7520833333333333 | 83.205 |
| 0.7527777777777778 | 83.205 |
| 0.7534722222222222 | 83.205 |
| 0.7541666666666668 | 83.205 |
| 0.7548611111111111 | 83.205 |
| 0.7555555555555555 | 78.722 |
| 0.75625 | 78.722 |
| 0.7569444444444445 | 78.722 |
| 0.7576388888888889 | 74.246 |
| 0.7583333333333333 | 74.246 |
| 0.7590277777777777 | 74.246 |
| 0.7597222222222223 | 74.246 |
| 0.7604166666666666 | 74.246 |
| 0.7611111111111111 | 69.775 |
| 0.7618055555555556 | 69.775 |
| 0.7625000000000001 | 69.775 |
| 0.7631944444444444 | 69.775 |
| 0.7638888888888888 | 65.31 |
| 0.7645833333333334 | 65.31 |
| 0.7652777777777778 | 60.85 |
| 0.7659722222222222 | 56.398 |
| 0.7666666666666666 | 56.398 |
| 0.7673611111111112 | 56.398 |
| 0.7680555555555556 | 56.398 |
| 0.7687499999999999 | 56.398 |
| 0.7694444444444444 | 56.398 |
| 0.7701388888888889 | 56.398 |
| 0.7708333333333334 | 51.951 |
| 0.7715277777777777 | 51.951 |
| 0.7722222222222223 | 51.951 |
| 0.7729166666666667 | 51.951 |
| 0.7736111111111111 | 47.511 |
| 0.7743055555555555 | 47.511 |
| 0.775 | 47.511 |
| 0.7756944444444445 | 43.079 |
| 0.7763888888888889 | 43.079 |
| 0.7770833333333332 | 43.079 |
| 0.7777777777777778 | 43.079 |
| 0.7784722222222222 | 38.653 |
| 0.7791666666666667 | 38.653 |
| 0.779861111111111 | 38.653 |
| 0.7805555555555556 | 38.653 |
| 0.78125 | 38.653 |
| 0.7819444444444444 | 38.653 |
| 0.782638888888889 | 34.234 |
| 0.7833333333333333 | 34.234 |
| 0.7840277777777778 | 34.234 |
| 0.7847222222222222 | 34.234 |
| 0.7854166666666668 | 29.823 |
| 0.7861111111111111 | 29.823 |
| 0.7868055555555555 | 29.823 |
| 0.7875 | 29.823 |
| 0.7881944444444445 | 25.419 |
| 0.7888888888888889 | 25.419 |
| 0.7895833333333333 | 25.419 |
| 0.7902777777777777 | 25.419 |
| 0.7909722222222223 | 21.024 |
| 0.7916666666666666 | 21.024 |
| 0.7923611111111111 | 21.024 |
| 0.7930555555555556 | 21.024 |
| 0.7937500000000001 | 21.024 |
| 0.7944444444444444 | 16.636 |
| 0.7951388888888888 | 16.636 |
| 0.7958333333333334 | 12.257 |
| 0.7965277777777778 | 12.257 |
| 0.7972222222222222 | 12.257 |
| 0.7979166666666666 | 12.257 |
| 0.7986111111111112 | 12.257 |
| 0.7993055555555556 | 12.257 |
| 0.7999999999999999 | 12.257 |
| 0.8006944444444444 | 7.887 |
| 0.8013888888888889 | 7.887 |
| 0.8020833333333334 | 7.887 |
| 0.8027777777777777 | 7.887 |
| 0.8034722222222223 | 7.887 |
| 0.8041666666666667 | 7.887 |
| 0.8048611111111111 | 3.525 |
| 0.8055555555555555 | 3.525 |
| 0.80625 | 3.525 |
| 0.8069444444444445 | 3.525 |
| 0.8076388888888889 | 3.525 |
| 0.8083333333333332 | 3.525 |
| 0.8090277777777778 | 3.525 |
| 0.8097222222222222 | 3.525 |
| 0.8104166666666667 | 0 |
| 0.811111111111111 | 3.525 |
| 0.8118055555555556 | 0 |
| 0.8125 | 0 |
| 0.8131944444444444 | 0 |
| 0.813888888888889 | 0 |
| 0.8145833333333333 | 0 |
| 0.8152777777777778 | 0 |
| 0.8159722222222222 | 0 |
| 0.8166666666666668 | 0 |
| 0.8173611111111111 | 0 |
| 0.8180555555555555 | 0 |
| 0.81875 | 0 |
| 0.8194444444444445 | 0 |
| 0.8201388888888889 | 0 |
| 0.8208333333333333 | 0 |
| 0.8215277777777777 | 0 |
| 0.8222222222222223 | 0 |
| 0.8229166666666666 | 0 |
| 0.8236111111111111 | 0 |
| 0.8243055555555556 | 0 |
| 0.8250000000000001 | 0 |
| 0.8256944444444444 | 0 |
| 0.8263888888888888 | 0 |
| 0.8270833333333334 | 0 |
| 0.8277777777777778 | 0 |
| 0.8284722222222222 | 0 |
| 0.8291666666666666 | 0 |
| 0.8298611111111112 | 0 |
| 0.8305555555555556 | 0 |
| 0.8312499999999999 | 0 |
| 0.8319444444444444 | 0 |
| 0.8326388888888889 | 0 |
| 0.8333333333333334 | 0 |
| 0.8340277777777777 | 0 |
| 0.8347222222222223 | 0 |
| 0.8354166666666667 | 0 |
| 0.8361111111111111 | 0 |
| 0.8368055555555555 | 0 |
| 0.8375 | 0 |
| 0.8381944444444445 | 0 |
| 0.8388888888888889 | 0 |
| 0.8395833333333332 | 0 |
| 0.8402777777777778 | 0 |
| 0.8409722222222222 | 0 |
| 0.8416666666666667 | 0 |
| 0.842361111111111 | 0 |
| 0.8430555555555556 | 0 |
| 0.84375 | 0 |
| 0.8444444444444444 | 0 |
| 0.845138888888889 | 0 |
| 0.8458333333333333 | 0 |
| 0.8465277777777778 | 0 |
| 0.8472222222222222 | 0 |
| 0.8479166666666668 | 0 |
| 0.8486111111111111 | 0 |
| 0.8493055555555555 | 0 |
| 0.85 | 0 |
| 0.8506944444444445 | 0 |
| 0.8513888888888889 | 0 |
| 0.8520833333333333 | 0 |
| 0.8527777777777777 | 0 |
| 0.8534722222222223 | 0 |
| 0.8541666666666666 | 0 |
| 0.8548611111111111 | 0 |
| 0.8555555555555556 | 0 |
| 0.8562500000000001 | 0 |
| 0.8569444444444444 | 0 |
| 0.8576388888888888 | 0 |
| 0.8583333333333334 | 0 |
| 0.8590277777777778 | 0 |
| 0.8597222222222222 | 0 |
| 0.8604166666666666 | 0 |
| 0.8611111111111112 | 0 |
| 0.8618055555555556 | 0 |
| 0.8624999999999999 | 0 |
| 0.8631944444444444 | 0 |
| 0.8638888888888889 | 0 |
| 0.8645833333333334 | 0 |
| 0.8652777777777777 | 0 |
| 0.8659722222222223 | 0 |
| 0.8666666666666667 | 0 |
| 0.8673611111111111 | 0 |
| 0.8680555555555555 | 0 |
| 0.86875 | 0 |
| 0.8694444444444445 | 0 |
| 0.8701388888888889 | 0 |
| 0.8708333333333332 | 0 |
| 0.8715277777777778 | 0 |
| 0.8722222222222222 | 0 |
| 0.8729166666666667 | 0 |
| 0.873611111111111 | 0 |
| 0.8743055555555556 | 0 |
| 0.875 | 0 |
| 0.8756944444444444 | 0 |
| 0.876388888888889 | 0 |
| 0.8770833333333333 | 0 |
| 0.8777777777777778 | 0 |
| 0.8784722222222222 | 0 |
| 0.8791666666666668 | 0 |
| 0.8798611111111111 | 0 |
| 0.8805555555555555 | 0 |
| 0.88125 | 0 |
| 0.8819444444444445 | 0 |
| 0.8826388888888889 | 0 |
| 0.8833333333333333 | 0 |
| 0.8840277777777777 | 0 |
| 0.8847222222222223 | 0 |
| 0.8854166666666666 | 0 |
| 0.8861111111111111 | 0 |
| 0.8868055555555556 | 0 |
| 0.8875000000000001 | 0 |
| 0.8881944444444444 | 0 |
| 0.8888888888888888 | 0 |
| 0.8895833333333334 | 0 |
| 0.8902777777777778 | 0 |
| 0.8909722222222222 | 0 |
| 0.8916666666666666 | 0 |
| 0.8923611111111112 | 0 |
| 0.8930555555555556 | 0 |
| 0.8937499999999999 | 0 |
| 0.8944444444444444 | 0 |
| 0.8951388888888889 | 0 |
| 0.8958333333333334 | 0 |
| 0.8965277777777777 | 0 |
| 0.8972222222222223 | 0 |
| 0.8979166666666667 | 0 |
| 0.8986111111111111 | 0 |
| 0.8993055555555555 | 0 |
| 0.9 | 0 |
| 0.9006944444444445 | 0 |
| 0.9013888888888889 | 0 |
| 0.9020833333333332 | 0 |
| 0.9027777777777778 | 0 |
| 0.9034722222222222 | 0 |
| 0.9041666666666667 | 0 |
| 0.904861111111111 | 0 |
| 0.9055555555555556 | 0 |
| 0.90625 | 0 |
| 0.9069444444444444 | 0 |
| 0.907638888888889 | 0 |
| 0.9083333333333333 | 0 |
| 0.9090277777777778 | 0 |
| 0.9097222222222222 | 0 |
| 0.9104166666666668 | 0 |
| 0.9111111111111111 | 0 |
| 0.9118055555555555 | 0 |
| 0.9125 | 0 |
| 0.9131944444444445 | 0 |
| 0.9138888888888889 | 0 |
| 0.9145833333333333 | 0 |
| 0.9152777777777777 | 0 |
| 0.9159722222222223 | 0 |
| 0.9166666666666666 | 0 |
| 0.9173611111111111 | 0 |
| 0.9180555555555556 | 0 |
| 0.9187500000000001 | 0 |
| 0.9194444444444444 | 0 |
| 0.9201388888888888 | 0 |
| 0.9208333333333334 | 0 |
| 0.9215277777777778 | 0 |
| 0.9222222222222222 | 0 |
| 0.9229166666666666 | 0 |
| 0.9236111111111112 | 0 |
| 0.9243055555555556 | 0 |
| 0.9249999999999999 | 0 |
| 0.9256944444444444 | 0 |
| 0.9263888888888889 | 0 |
| 0.9270833333333334 | 0 |
| 0.9277777777777777 | 0 |
| 0.9284722222222223 | 0 |
| 0.9291666666666667 | 0 |
| 0.9298611111111111 | 0 |
| 0.9305555555555555 | 0 |
| 0.93125 | 0 |
| 0.9319444444444445 | 0 |
| 0.9326388888888889 | 0 |
| 0.9333333333333332 | 0 |
| 0.9340277777777778 | 0 |
| 0.9347222222222222 | 0 |
| 0.9354166666666667 | 0 |
| 0.936111111111111 | 0 |
| 0.9368055555555556 | 0 |
| 0.9375 | 0 |
| 0.9381944444444444 | 0 |
| 0.938888888888889 | 0 |
| 0.9395833333333333 | 0 |
| 0.9402777777777778 | 0 |
| 0.9409722222222222 | 0 |
| 0.9416666666666668 | 0 |
| 0.9423611111111111 | 0 |
| 0.9430555555555555 | 0 |
| 0.94375 | 0 |
| 0.9444444444444445 | 0 |
| 0.9451388888888889 | 0 |
| 0.9458333333333333 | 0 |
| 0.9465277777777777 | 0 |
| 0.9472222222222223 | 0 |
| 0.9479166666666666 | 0 |
| 0.9486111111111111 | 0 |
| 0.9493055555555556 | 0 |
| 0.9500000000000001 | 0 |
| 0.9506944444444444 | 0 |
| 0.9513888888888888 | 0 |
| 0.9520833333333334 | 0 |
| 0.9527777777777778 | 0 |
| 0.9534722222222222 | 0 |
| 0.9541666666666666 | 0 |
| 0.9548611111111112 | 0 |
| 0.9555555555555556 | 0 |
| 0.9562499999999999 | 0 |
| 0.9569444444444444 | 0 |
| 0.9576388888888889 | 0 |
| 0.9583333333333334 | 0 |
| 0.9590277777777777 | 0 |
| 0.9597222222222223 | 0 |
| 0.9604166666666667 | 0 |
| 0.9611111111111111 | 0 |
| 0.9618055555555555 | 0 |
| 0.9625 | 0 |
| 0.9631944444444445 | 0 |
| 0.9638888888888889 | 0 |
| 0.9645833333333332 | 0 |
| 0.9652777777777778 | 0 |
| 0.9659722222222222 | 0 |
| 0.9666666666666667 | 0 |
| 0.967361111111111 | 0 |
| 0.9680555555555556 | 0 |
| 0.96875 | 0 |
| 0.9694444444444444 | 0 |
| 0.970138888888889 | 0 |
| 0.9708333333333333 | 0 |
| 0.9715277777777778 | 0 |
| 0.9722222222222222 | 0 |
| 0.9729166666666668 | 0 |
| 0.9736111111111111 | 0 |
| 0.9743055555555555 | 0 |
| 0.975 | 0 |
| 0.9756944444444445 | 0 |
| 0.9763888888888889 | 0 |
| 0.9770833333333333 | 0 |
| 0.9777777777777777 | 0 |
| 0.9784722222222223 | 0 |
| 0.9791666666666666 | 0 |
| 0.9798611111111111 | 0 |
| 0.9805555555555556 | 0 |
| 0.9812500000000001 | 0 |
| 0.9819444444444444 | 0 |
| 0.9826388888888888 | 0 |
| 0.9833333333333334 | 0 |
| 0.9840277777777778 | 0 |
| 0.9847222222222222 | 0 |
| 0.9854166666666666 | 0 |
| 0.9861111111111112 | 0 |
| 0.9868055555555556 | 0 |
| 0.9874999999999999 | 0 |
| 0.9881944444444444 | 0 |
| 0.9888888888888889 | 0 |
| 0.9895833333333334 | 0 |
| 0.9902777777777777 | 0 |
| 0.9909722222222223 | 0 |
| 0.9916666666666667 | 0 |
| 0.9923611111111111 | 0 |
| 0.9930555555555555 | 0 |
| 0.99375 | 0 |
| 0.9944444444444445 | 0 |
| 0.9951388888888889 | 0 |
| 0.9958333333333332 | 0 |
| 0.9965277777777778 | 0 |
| 0.9972222222222222 | 0 |
| 0.9979166666666667 | 0 |
| 0.998611111111111 | 0 |
| 0.9993055555555556 | 0 |